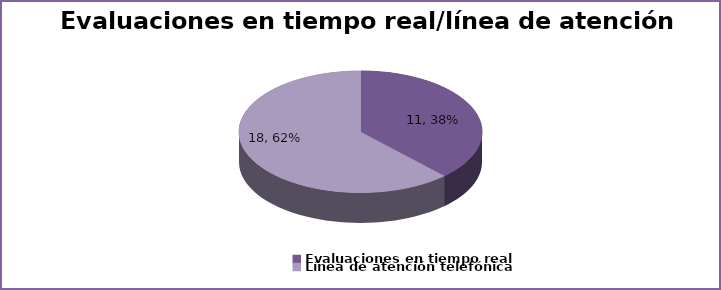
| Category | Series 0 |
|---|---|
| Evaluaciones en tiempo real | 11 |
| Línea de atención telefónica | 18 |